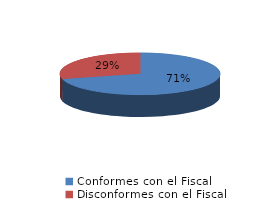
| Category | Series 0 |
|---|---|
| 0 | 117 |
| 1 | 48 |